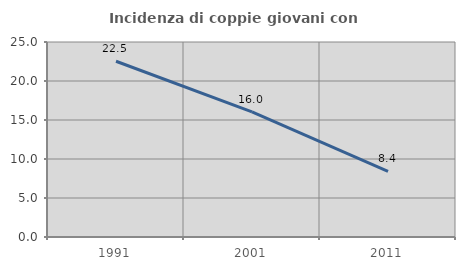
| Category | Incidenza di coppie giovani con figli |
|---|---|
| 1991.0 | 22.528 |
| 2001.0 | 16.049 |
| 2011.0 | 8.428 |